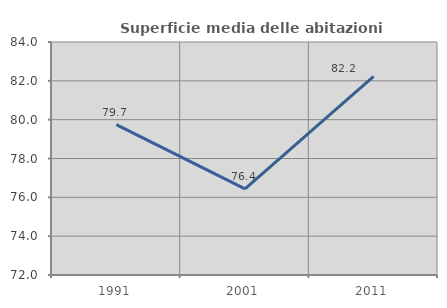
| Category | Superficie media delle abitazioni occupate |
|---|---|
| 1991.0 | 79.744 |
| 2001.0 | 76.433 |
| 2011.0 | 82.225 |